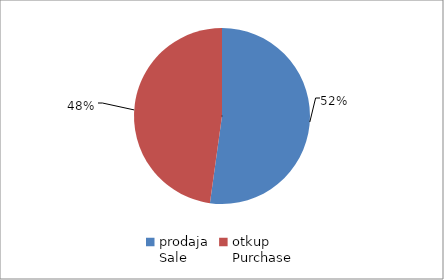
| Category | Series 0 |
|---|---|
| prodaja
Sale | 40597059 |
| otkup
Purchase | 37182017.8 |